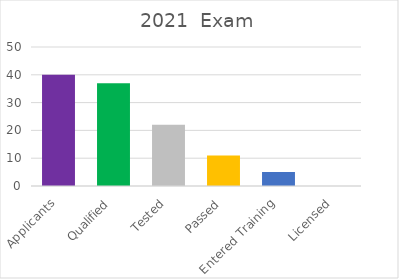
| Category | 2021  Exam |
|---|---|
| Applicants | 40 |
| Qualified | 37 |
| Tested | 22 |
| Passed | 11 |
| Entered Training | 5 |
| Licensed | 0 |